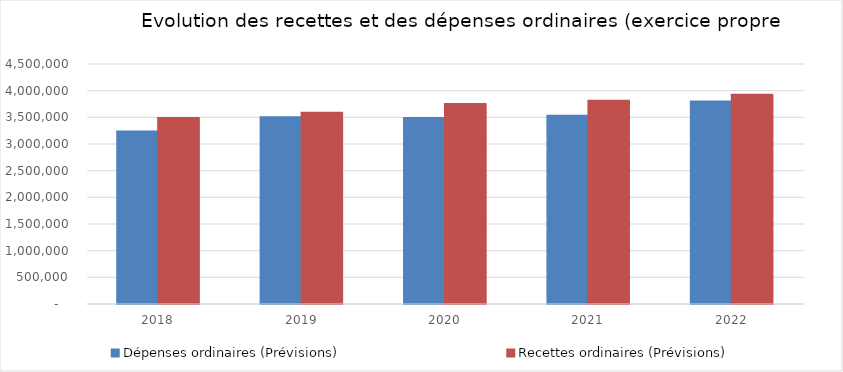
| Category | Dépenses ordinaires (Prévisions) | Recettes ordinaires (Prévisions) |
|---|---|---|
| 2018.0 | 3226802.71 | 3479690.75 |
| 2019.0 | 3493940.12 | 3575409.26 |
| 2020.0 | 3477208.75 | 3742475.44 |
| 2021.0 | 3519209.39 | 3801009.83 |
| 2022.0 | 3785617.7 | 3913148.44 |